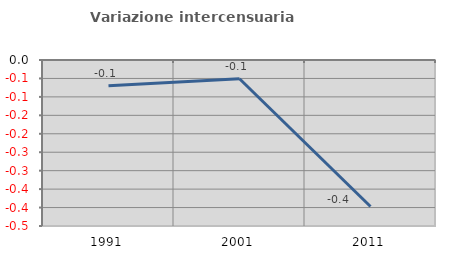
| Category | Variazione intercensuaria annua |
|---|---|
| 1991.0 | -0.07 |
| 2001.0 | -0.051 |
| 2011.0 | -0.397 |